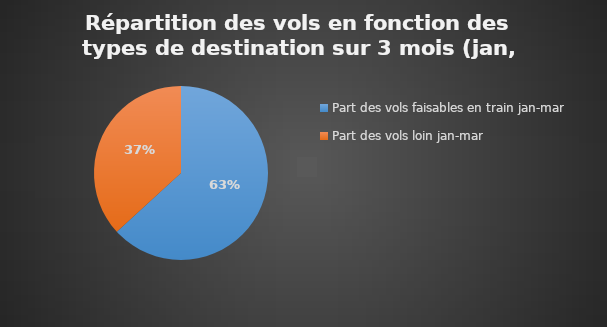
| Category | Series 0 |
|---|---|
| Part des vols faisables en train jan-mar | 0.632 |
| Part des vols loin jan-mar | 0.368 |